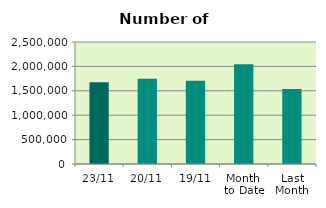
| Category | Series 0 |
|---|---|
| 23/11 | 1674300 |
| 20/11 | 1745196 |
| 19/11 | 1703924 |
| Month 
to Date | 2045523.125 |
| Last
Month | 1538680.909 |